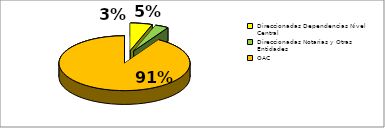
| Category | Series 0 |
|---|---|
| Direccionadas Dependencias Nivel Central | 0.054 |
| Direccionadas Notarias y Otras Entidades | 0.033 |
| OAC | 0.912 |